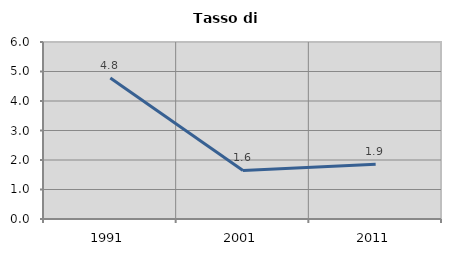
| Category | Tasso di disoccupazione   |
|---|---|
| 1991.0 | 4.78 |
| 2001.0 | 1.646 |
| 2011.0 | 1.857 |